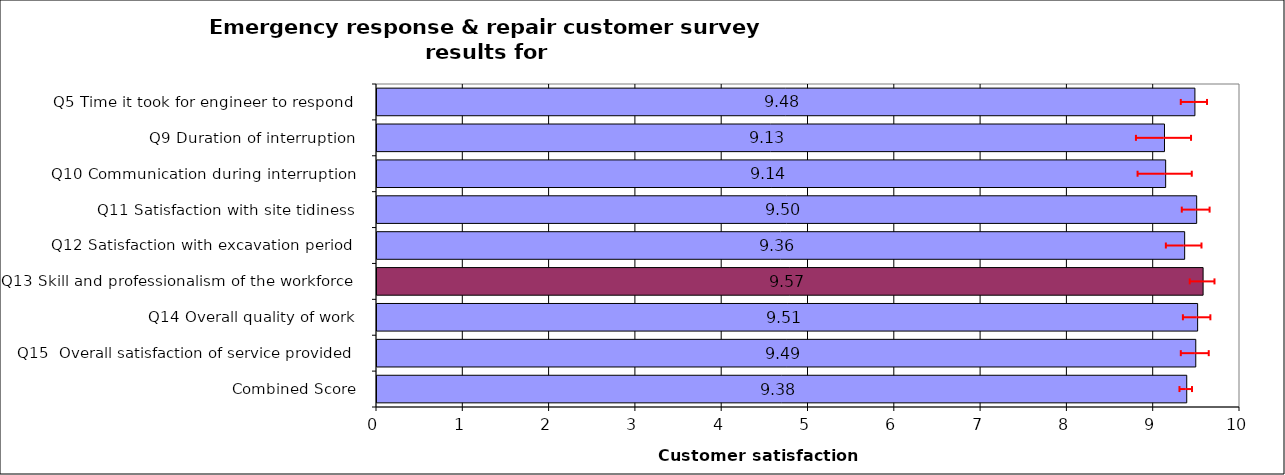
| Category | Series 0 |
|---|---|
| Q5 Time it took for engineer to respond | 9.477 |
| Q9 Duration of interruption | 9.125 |
| Q10 Communication during interruption | 9.139 |
| Q11 Satisfaction with site tidiness | 9.498 |
| Q12 Satisfaction with excavation period | 9.359 |
| Q13 Skill and professionalism of the workforce | 9.573 |
| Q14 Overall quality of work | 9.509 |
| Q15  Overall satisfaction of service provided | 9.488 |
| Combined Score | 9.383 |